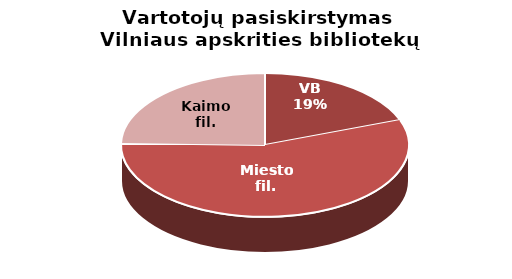
| Category | Series 0 |
|---|---|
| VB | 21595 |
| Miesto fil. | 62522 |
| Kaimo fil. | 27401 |